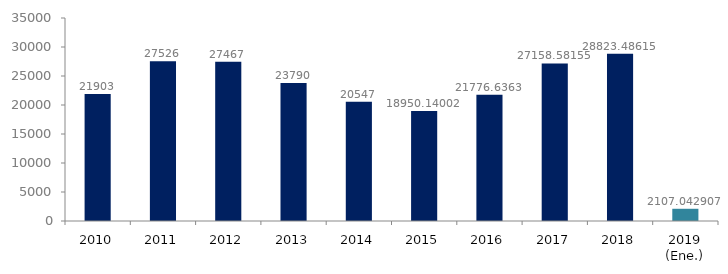
| Category | Series 1 |
|---|---|
| 2010 | 21903 |
| 2011 | 27526 |
| 2012 | 27467 |
| 2013 | 23790 |
| 2014 | 20547 |
| 2015 | 18950.14 |
| 2016 | 21776.636 |
| 2017 | 27158.582 |
| 2018 | 28823.486 |
| 2019 (Ene.) | 2107.043 |